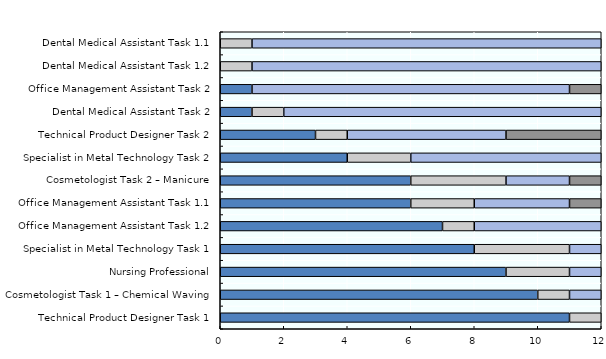
| Category | No (0%, 25%) | 50% Maybe | Yes (75%, 100%) | Don't know |
|---|---|---|---|---|
| Technical Product Designer Task 1 | 11 | 1 | 0 | 0 |
| Cosmetologist Task 1 – Chemical Waving | 10 | 1 | 1 | 0 |
| Nursing Professional | 9 | 2 | 1 | 0 |
| Specialist in Metal Technology Task 1 | 8 | 3 | 1 | 0 |
| Office Management Assistant Task 1.2 | 7 | 1 | 4 | 0 |
| Office Management Assistant Task 1.1 | 6 | 2 | 3 | 1 |
| Cosmetologist Task 2 – Manicure | 6 | 3 | 2 | 1 |
| Specialist in Metal Technology Task 2 | 4 | 2 | 6 | 0 |
| Technical Product Designer Task 2 | 3 | 1 | 5 | 3 |
| Dental Medical Assistant Task 2 | 1 | 1 | 10 | 0 |
| Office Management Assistant Task 2 | 1 | 0 | 10 | 1 |
| Dental Medical Assistant Task 1.2 | 0 | 1 | 11 | 0 |
| Dental Medical Assistant Task 1.1 | 0 | 1 | 11 | 0 |